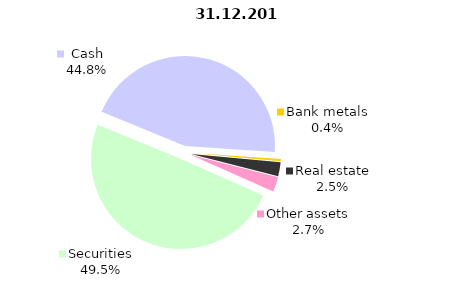
| Category | 31.12.2017 |
|---|---|
| Securities | 1221.6 |
| Cash | 1105.5 |
| Bank metals | 10.1 |
| Real estate | 62.6 |
| Other assets | 65.8 |